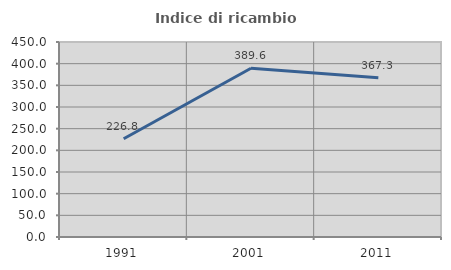
| Category | Indice di ricambio occupazionale  |
|---|---|
| 1991.0 | 226.761 |
| 2001.0 | 389.552 |
| 2011.0 | 367.327 |